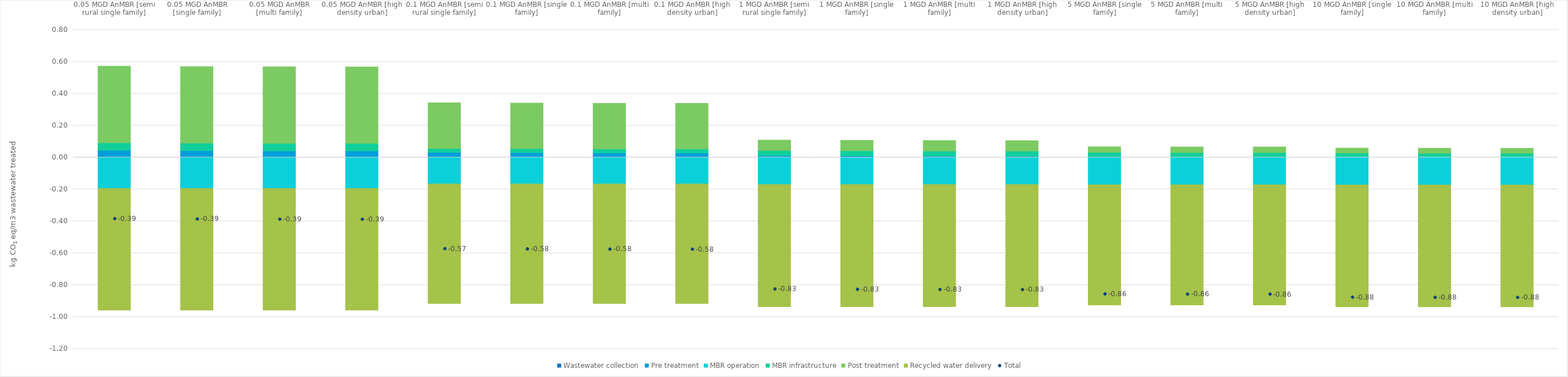
| Category | Wastewater collection | Pre treatment | MBR operation | MBR infrastructure | Post treatment | Recycled water delivery |
|---|---|---|---|---|---|---|
| 0.05 MGD AnMBR [semi rural single family] | 0.004 | 0.041 | -0.194 | 0.048 | 0.48 | -0.763 |
| 0.05 MGD AnMBR [single family] | 0.002 | 0.041 | -0.194 | 0.048 | 0.48 | -0.763 |
| 0.05 MGD AnMBR [multi family] | 0.001 | 0.041 | -0.194 | 0.048 | 0.48 | -0.763 |
| 0.05 MGD AnMBR [high density urban] | 0 | 0.041 | -0.194 | 0.048 | 0.48 | -0.763 |
| 0.1 MGD AnMBR [semi rural single family] | 0.004 | 0.028 | -0.166 | 0.025 | 0.285 | -0.75 |
| 0.1 MGD AnMBR [single family] | 0.002 | 0.028 | -0.166 | 0.025 | 0.285 | -0.75 |
| 0.1 MGD AnMBR [multi family] | 0.001 | 0.028 | -0.166 | 0.025 | 0.285 | -0.75 |
| 0.1 MGD AnMBR [high density urban] | 0 | 0.028 | -0.166 | 0.025 | 0.285 | -0.75 |
| 1 MGD AnMBR [semi rural single family] | 0.004 | 0.009 | -0.17 | 0.031 | 0.065 | -0.766 |
| 1 MGD AnMBR [single family] | 0.002 | 0.009 | -0.17 | 0.031 | 0.065 | -0.766 |
| 1 MGD AnMBR [multi family] | 0.001 | 0.009 | -0.17 | 0.031 | 0.065 | -0.766 |
| 1 MGD AnMBR [high density urban] | 0 | 0.009 | -0.17 | 0.031 | 0.065 | -0.766 |
| 5 MGD AnMBR [single family] | 0.002 | 0.004 | -0.172 | 0.026 | 0.036 | -0.753 |
| 5 MGD AnMBR [multi family] | 0.001 | 0.004 | -0.172 | 0.026 | 0.036 | -0.753 |
| 5 MGD AnMBR [high density urban] | 0 | 0.004 | -0.172 | 0.026 | 0.036 | -0.753 |
| 10 MGD AnMBR [single family] | 0.002 | 0.003 | -0.173 | 0.023 | 0.031 | -0.764 |
| 10 MGD AnMBR [multi family] | 0.001 | 0.003 | -0.173 | 0.023 | 0.031 | -0.764 |
| 10 MGD AnMBR [high density urban] | 0 | 0.003 | -0.173 | 0.023 | 0.031 | -0.764 |